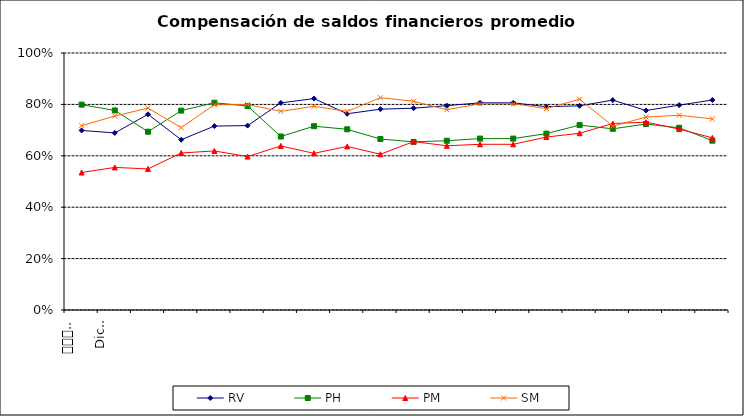
| Category | RV | PH | PM | SM |
|---|---|---|---|---|
| 0 | 0.699 | 0.799 | 0.535 | 0.717 |
| 1 | 0.689 | 0.776 | 0.555 | 0.755 |
| 2 | 0.762 | 0.694 | 0.549 | 0.786 |
| 3 | 0.662 | 0.776 | 0.611 | 0.71 |
| 4 | 0.716 | 0.806 | 0.619 | 0.799 |
| 5 | 0.718 | 0.794 | 0.597 | 0.799 |
| 6 | 0.806 | 0.675 | 0.638 | 0.773 |
| 7 | 0.823 | 0.715 | 0.61 | 0.793 |
| 8 | 0.764 | 0.703 | 0.637 | 0.773 |
| 9 | 0.781 | 0.665 | 0.606 | 0.826 |
| 10 | 0.785 | 0.654 | 0.655 | 0.812 |
| 11 | 0.795 | 0.659 | 0.639 | 0.779 |
| 12 | 0.806 | 0.667 | 0.645 | 0.803 |
| 13 | 0.806 | 0.667 | 0.645 | 0.803 |
| 14 | 0.791 | 0.686 | 0.673 | 0.784 |
| 15 | 0.794 | 0.719 | 0.688 | 0.82 |
| 16 | 0.817 | 0.705 | 0.726 | 0.715 |
| 17 | 0.776 | 0.724 | 0.731 | 0.751 |
| 18 | 0.797 | 0.709 | 0.704 | 0.758 |
| 19 | 0.817 | 0.659 | 0.67 | 0.744 |